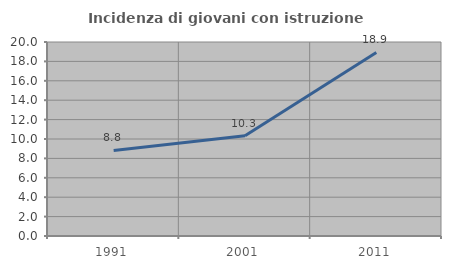
| Category | Incidenza di giovani con istruzione universitaria |
|---|---|
| 1991.0 | 8.824 |
| 2001.0 | 10.345 |
| 2011.0 | 18.919 |